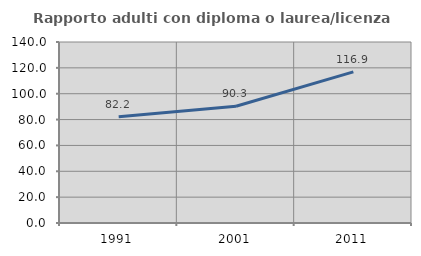
| Category | Rapporto adulti con diploma o laurea/licenza media  |
|---|---|
| 1991.0 | 82.186 |
| 2001.0 | 90.274 |
| 2011.0 | 116.932 |